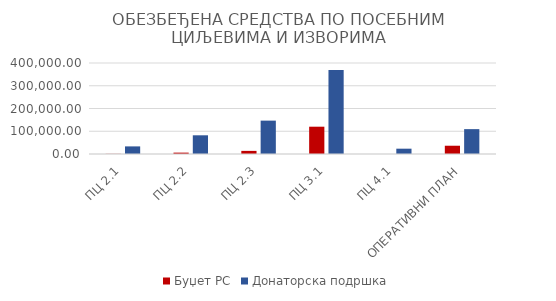
| Category | Буџет РС | Донаторска подршка |
|---|---|---|
| ПЦ 2.1 | 650 | 33452.3 |
| ПЦ 2.2 | 6000 | 82208.1 |
| ПЦ 2.3 | 13730.656 | 146681.346 |
| ПЦ 3.1 | 120000 | 368994.95 |
| ПЦ 4.1 | 0 | 23365.22 |
| ОПЕРАТИВНИ ПЛАН | 36352.69 | 109304.88 |